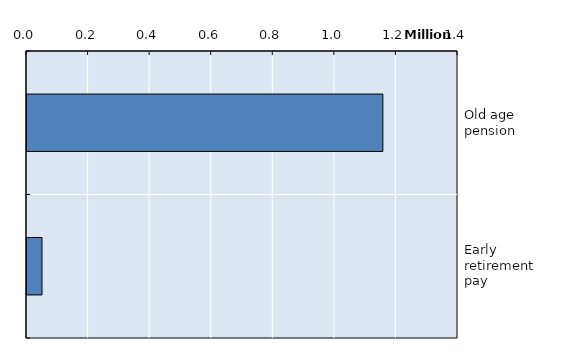
| Category | Series 0 |
|---|---|
| Old age pension | 1155953 |
| Early retirement pay | 48748 |